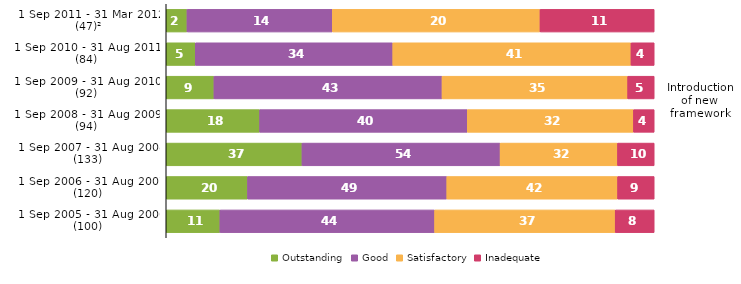
| Category | Outstanding | Good | Satisfactory | Inadequate |
|---|---|---|---|---|
| 1 Sep 2011 - 31 Mar 2012 (47)² | 2 | 14 | 20 | 11 |
| 1 Sep 2010 - 31 Aug 2011  (84) | 5 | 34 | 41 | 4 |
| 1 Sep 2009 - 31 Aug 2010  (92) | 9 | 43 | 35 | 5 |
| 1 Sep 2008 - 31 Aug 2009  (94) | 18 | 40 | 32 | 4 |
| 1 Sep 2007 - 31 Aug 2008 (133) | 37 | 54 | 32 | 10 |
| 1 Sep 2006 - 31 Aug 2007 (120) | 20 | 49 | 42 | 9 |
| 1 Sep 2005 - 31 Aug 2006 (100) | 11 | 44 | 37 | 8 |